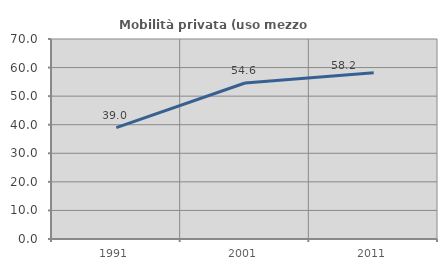
| Category | Mobilità privata (uso mezzo privato) |
|---|---|
| 1991.0 | 38.969 |
| 2001.0 | 54.611 |
| 2011.0 | 58.167 |